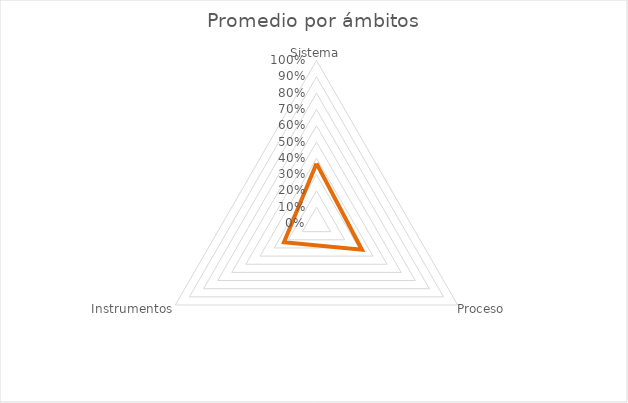
| Category | Series1 |
|---|---|
| Sistema | 0.369 |
| Proceso | 0.322 |
| Instrumentos | 0.23 |